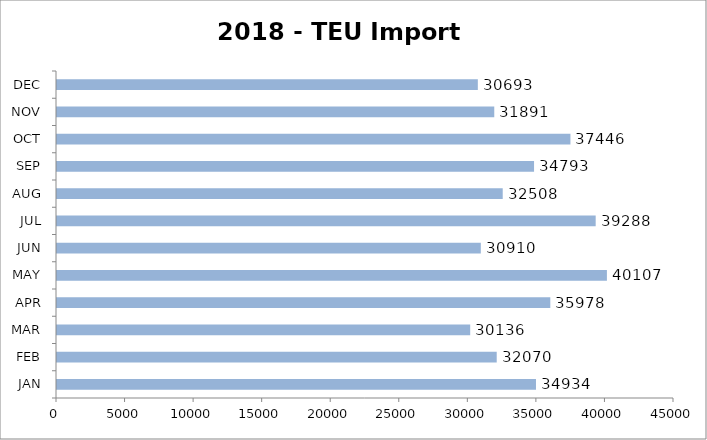
| Category | TEU |
|---|---|
| JAN | 34934 |
| FEB | 32070 |
| MAR | 30136 |
| APR | 35978 |
| MAY | 40107 |
| JUN | 30910 |
| JUL | 39288 |
| AUG | 32508 |
| SEP | 34793 |
| OCT | 37446 |
| NOV | 31891 |
| DEC | 30693 |